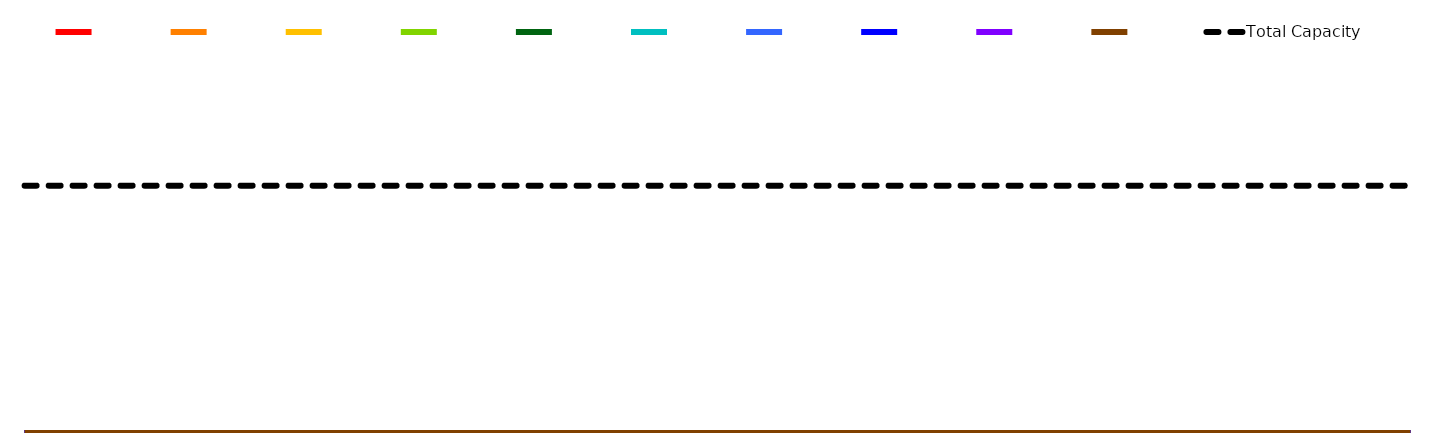
| Category | Series 0 | Series 1 | Series 2 | Series 3 | Series 4 | Series 5 | Series 6 | Series 7 | Series 8 | Series 9 | Total Capacity |
|---|---|---|---|---|---|---|---|---|---|---|---|
| 0 | 0 | 0 | 0 | 0 | 0 | 0 | 0 | 0 | 0 | 0 | 1 |
| 1 | 0 | 0 | 0 | 0 | 0 | 0 | 0 | 0 | 0 | 0 | 1 |
| 2 | 0 | 0 | 0 | 0 | 0 | 0 | 0 | 0 | 0 | 0 | 1 |
| 3 | 0 | 0 | 0 | 0 | 0 | 0 | 0 | 0 | 0 | 0 | 1 |
| 4 | 0 | 0 | 0 | 0 | 0 | 0 | 0 | 0 | 0 | 0 | 1 |
| 5 | 0 | 0 | 0 | 0 | 0 | 0 | 0 | 0 | 0 | 0 | 1 |
| 6 | 0 | 0 | 0 | 0 | 0 | 0 | 0 | 0 | 0 | 0 | 1 |
| 7 | 0 | 0 | 0 | 0 | 0 | 0 | 0 | 0 | 0 | 0 | 1 |
| 8 | 0 | 0 | 0 | 0 | 0 | 0 | 0 | 0 | 0 | 0 | 1 |
| 9 | 0 | 0 | 0 | 0 | 0 | 0 | 0 | 0 | 0 | 0 | 1 |
| 10 | 0 | 0 | 0 | 0 | 0 | 0 | 0 | 0 | 0 | 0 | 1 |
| 11 | 0 | 0 | 0 | 0 | 0 | 0 | 0 | 0 | 0 | 0 | 1 |
| 12 | 0 | 0 | 0 | 0 | 0 | 0 | 0 | 0 | 0 | 0 | 1 |
| 13 | 0 | 0 | 0 | 0 | 0 | 0 | 0 | 0 | 0 | 0 | 1 |
| 14 | 0 | 0 | 0 | 0 | 0 | 0 | 0 | 0 | 0 | 0 | 1 |
| 15 | 0 | 0 | 0 | 0 | 0 | 0 | 0 | 0 | 0 | 0 | 1 |
| 16 | 0 | 0 | 0 | 0 | 0 | 0 | 0 | 0 | 0 | 0 | 1 |
| 17 | 0 | 0 | 0 | 0 | 0 | 0 | 0 | 0 | 0 | 0 | 1 |
| 18 | 0 | 0 | 0 | 0 | 0 | 0 | 0 | 0 | 0 | 0 | 1 |
| 19 | 0 | 0 | 0 | 0 | 0 | 0 | 0 | 0 | 0 | 0 | 1 |
| 20 | 0 | 0 | 0 | 0 | 0 | 0 | 0 | 0 | 0 | 0 | 1 |
| 21 | 0 | 0 | 0 | 0 | 0 | 0 | 0 | 0 | 0 | 0 | 1 |
| 22 | 0 | 0 | 0 | 0 | 0 | 0 | 0 | 0 | 0 | 0 | 1 |
| 23 | 0 | 0 | 0 | 0 | 0 | 0 | 0 | 0 | 0 | 0 | 1 |
| 24 | 0 | 0 | 0 | 0 | 0 | 0 | 0 | 0 | 0 | 0 | 1 |
| 25 | 0 | 0 | 0 | 0 | 0 | 0 | 0 | 0 | 0 | 0 | 1 |
| 26 | 0 | 0 | 0 | 0 | 0 | 0 | 0 | 0 | 0 | 0 | 1 |
| 27 | 0 | 0 | 0 | 0 | 0 | 0 | 0 | 0 | 0 | 0 | 1 |
| 28 | 0 | 0 | 0 | 0 | 0 | 0 | 0 | 0 | 0 | 0 | 1 |
| 29 | 0 | 0 | 0 | 0 | 0 | 0 | 0 | 0 | 0 | 0 | 1 |
| 30 | 0 | 0 | 0 | 0 | 0 | 0 | 0 | 0 | 0 | 0 | 1 |
| 31 | 0 | 0 | 0 | 0 | 0 | 0 | 0 | 0 | 0 | 0 | 1 |
| 32 | 0 | 0 | 0 | 0 | 0 | 0 | 0 | 0 | 0 | 0 | 1 |
| 33 | 0 | 0 | 0 | 0 | 0 | 0 | 0 | 0 | 0 | 0 | 1 |
| 34 | 0 | 0 | 0 | 0 | 0 | 0 | 0 | 0 | 0 | 0 | 1 |
| 35 | 0 | 0 | 0 | 0 | 0 | 0 | 0 | 0 | 0 | 0 | 1 |
| 36 | 0 | 0 | 0 | 0 | 0 | 0 | 0 | 0 | 0 | 0 | 1 |
| 37 | 0 | 0 | 0 | 0 | 0 | 0 | 0 | 0 | 0 | 0 | 1 |
| 38 | 0 | 0 | 0 | 0 | 0 | 0 | 0 | 0 | 0 | 0 | 1 |
| 39 | 0 | 0 | 0 | 0 | 0 | 0 | 0 | 0 | 0 | 0 | 1 |
| 40 | 0 | 0 | 0 | 0 | 0 | 0 | 0 | 0 | 0 | 0 | 1 |
| 41 | 0 | 0 | 0 | 0 | 0 | 0 | 0 | 0 | 0 | 0 | 1 |
| 42 | 0 | 0 | 0 | 0 | 0 | 0 | 0 | 0 | 0 | 0 | 1 |
| 43 | 0 | 0 | 0 | 0 | 0 | 0 | 0 | 0 | 0 | 0 | 1 |
| 44 | 0 | 0 | 0 | 0 | 0 | 0 | 0 | 0 | 0 | 0 | 1 |
| 45 | 0 | 0 | 0 | 0 | 0 | 0 | 0 | 0 | 0 | 0 | 1 |
| 46 | 0 | 0 | 0 | 0 | 0 | 0 | 0 | 0 | 0 | 0 | 1 |
| 47 | 0 | 0 | 0 | 0 | 0 | 0 | 0 | 0 | 0 | 0 | 1 |
| 48 | 0 | 0 | 0 | 0 | 0 | 0 | 0 | 0 | 0 | 0 | 1 |
| 49 | 0 | 0 | 0 | 0 | 0 | 0 | 0 | 0 | 0 | 0 | 1 |
| 50 | 0 | 0 | 0 | 0 | 0 | 0 | 0 | 0 | 0 | 0 | 1 |
| 51 | 0 | 0 | 0 | 0 | 0 | 0 | 0 | 0 | 0 | 0 | 1 |